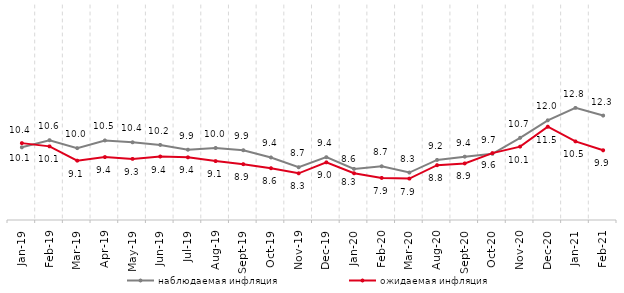
| Category | наблюдаемая инфляция | ожидаемая инфляция |
|---|---|---|
| 2019-01-01 | 10.071 | 10.363 |
| 2019-02-01 | 10.567 | 10.136 |
| 2019-03-01 | 10.013 | 9.141 |
| 2019-04-01 | 10.548 | 9.39 |
| 2019-05-01 | 10.421 | 9.264 |
| 2019-06-01 | 10.239 | 9.429 |
| 2019-07-01 | 9.904 | 9.371 |
| 2019-08-01 | 10.027 | 9.11 |
| 2019-09-01 | 9.867 | 8.894 |
| 2019-10-01 | 9.362 | 8.612 |
| 2019-11-01 | 8.68 | 8.257 |
| 2019-12-01 | 9.383 | 9.022 |
| 2020-01-01 | 8.566 | 8.259 |
| 2020-02-01 | 8.747 | 7.934 |
| 2020-03-01 | 8.311 | 7.888 |
| 2020-08-01 | 9.19 | 8.823 |
| 2020-09-01 | 9.419 | 8.948 |
| 2020-10-01 | 9.614 | 9.668 |
| 2020-11-01 | 10.734 | 10.121 |
| 2020-12-01 | 11.954 | 11.507 |
| 2021-01-01 | 12.821 | 10.484 |
| 2021-02-01 | 12.285 | 9.864 |